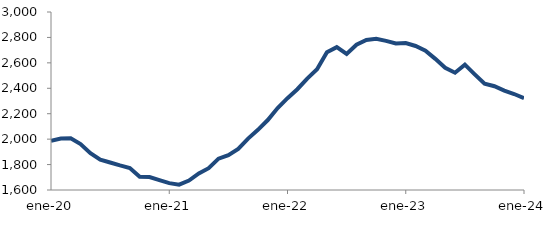
| Category | Series 0 |
|---|---|
| 2020-01-01 | 1987.031 |
| 2020-02-01 | 2004.612 |
| 2020-03-01 | 2005.967 |
| 2020-04-01 | 1961.731 |
| 2020-05-01 | 1889.917 |
| 2020-06-01 | 1839.086 |
| 2020-07-01 | 1816.171 |
| 2020-08-01 | 1793.174 |
| 2020-09-01 | 1772.502 |
| 2020-10-01 | 1703.481 |
| 2020-11-01 | 1701.776 |
| 2020-12-01 | 1677.184 |
| 2021-01-01 | 1654.072 |
| 2021-02-01 | 1641.869 |
| 2021-03-01 | 1673.821 |
| 2021-04-01 | 1730.759 |
| 2021-05-01 | 1771.425 |
| 2021-06-01 | 1846.573 |
| 2021-07-01 | 1874.111 |
| 2021-08-01 | 1922.894 |
| 2021-09-01 | 2004.225 |
| 2021-10-01 | 2073.331 |
| 2021-11-01 | 2150.314 |
| 2021-12-01 | 2244.492 |
| 2022-01-01 | 2321.95 |
| 2022-02-01 | 2392.65 |
| 2022-03-01 | 2476.383 |
| 2022-04-01 | 2549.069 |
| 2022-05-01 | 2683.336 |
| 2022-06-01 | 2723.868 |
| 2022-07-01 | 2670.585 |
| 2022-08-01 | 2742.913 |
| 2022-09-01 | 2780.46 |
| 2022-10-01 | 2788.916 |
| 2022-11-01 | 2772.628 |
| 2022-12-01 | 2752.307 |
| 2023-01-01 | 2755.69 |
| 2023-02-01 | 2732.653 |
| 2023-03-01 | 2696.107 |
| 2023-04-01 | 2631.454 |
| 2023-05-01 | 2561.826 |
| 2023-06-01 | 2522.703 |
| 2023-07-01 | 2586.296 |
| 2023-08-01 | 2509.777 |
| 2023-09-01 | 2436.109 |
| 2023-10-01 | 2416.11 |
| 2023-11-01 | 2381.816 |
| 2023-12-01 | 2354.903 |
| 2024-01-01 | 2322.347 |